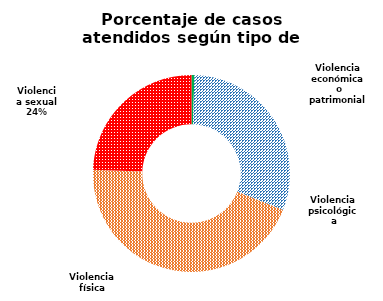
| Category | Series 0 |
|---|---|
| Violencia económica o patrimonial | 30 |
| Violencia psicológica | 1929 |
| Violencia física | 2813 |
| Violencia sexual | 1539 |